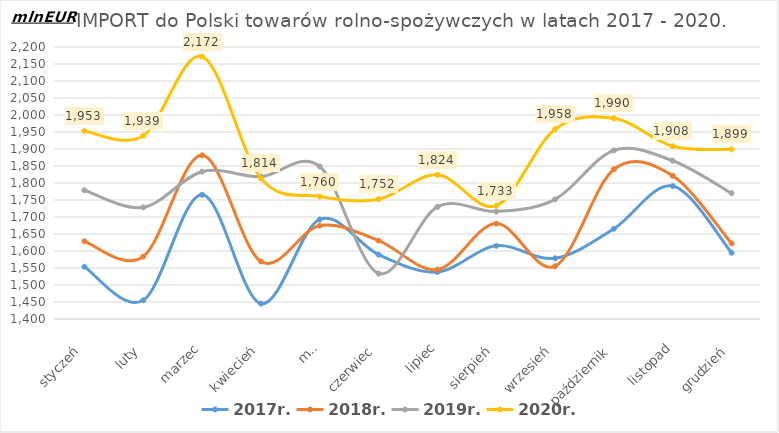
| Category | 2017r. | 2018r. | 2019r. | 2020r. |
|---|---|---|---|---|
| styczeń | 1553.644 | 1628.578 | 1778.516 | 1952.875 |
| luty | 1455.078 | 1583.616 | 1728.388 | 1939.238 |
| marzec | 1765.379 | 1881.347 | 1833.298 | 2171.859 |
| kwiecień | 1445.338 | 1569.107 | 1818.941 | 1813.505 |
| maj | 1692.776 | 1674.643 | 1848.523 | 1760.244 |
| czerwiec | 1589.18 | 1630.664 | 1533.822 | 1752.308 |
| lipiec | 1538.272 | 1545.544 | 1729.609 | 1824.019 |
| sierpień | 1615.409 | 1680.549 | 1716.034 | 1733.376 |
| wrzesień | 1578.504 | 1555.199 | 1751.943 | 1958.051 |
| październik | 1665.513 | 1840.454 | 1896.06 | 1990.136 |
| listopad | 1790.998 | 1821.041 | 1865.468 | 1908.281 |
| grudzień | 1594.875 | 1622.006 | 1769.878 | 1898.918 |